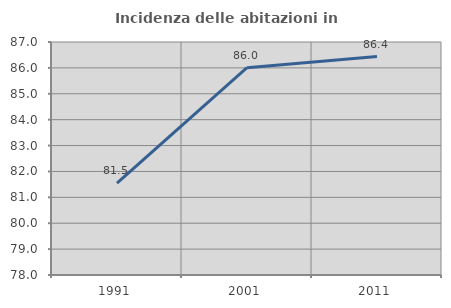
| Category | Incidenza delle abitazioni in proprietà  |
|---|---|
| 1991.0 | 81.544 |
| 2001.0 | 86.008 |
| 2011.0 | 86.44 |